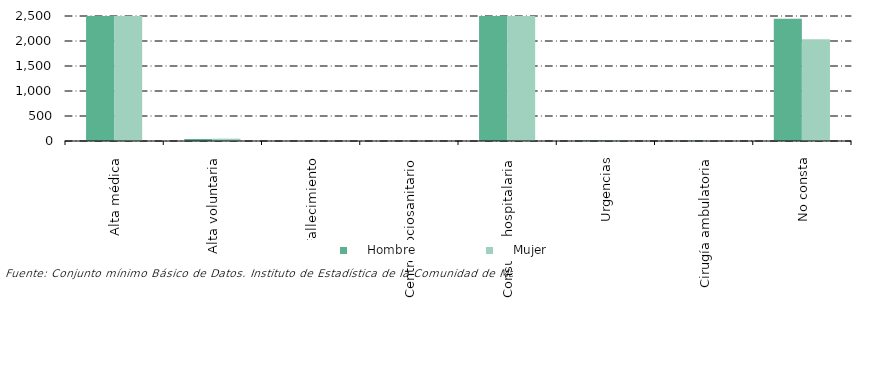
| Category |     Hombre |     Mujer |
|---|---|---|
| Alta médica | 44441 | 67147 |
| Alta voluntaria | 40 | 47 |
| Fallecimiento | 1 | 0 |
| Centro sociosanitario | 3 | 3 |
| Consulta hospitalaria | 14906 | 17306 |
| Urgencias | 13 | 11 |
| Cirugía ambulatoria | 6 | 5 |
| No consta | 2445 | 2035 |